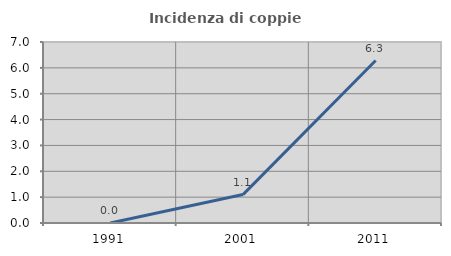
| Category | Incidenza di coppie miste |
|---|---|
| 1991.0 | 0 |
| 2001.0 | 1.099 |
| 2011.0 | 6.283 |